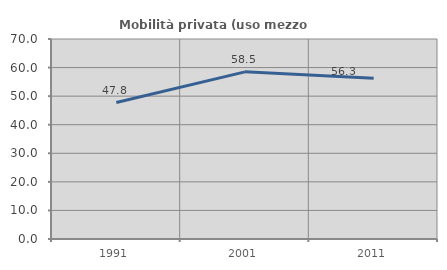
| Category | Mobilità privata (uso mezzo privato) |
|---|---|
| 1991.0 | 47.763 |
| 2001.0 | 58.505 |
| 2011.0 | 56.295 |